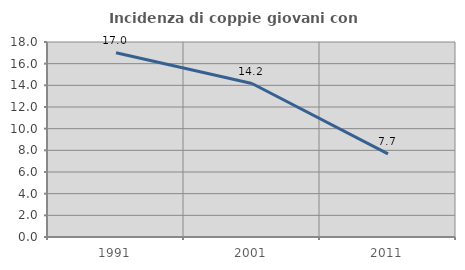
| Category | Incidenza di coppie giovani con figli |
|---|---|
| 1991.0 | 17.015 |
| 2001.0 | 14.167 |
| 2011.0 | 7.673 |